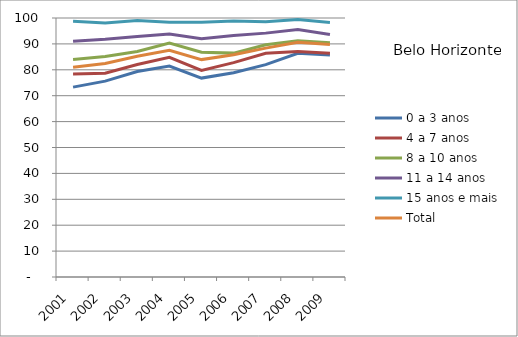
| Category | 0 a 3 anos | 4 a 7 anos | 8 a 10 anos | 11 a 14 anos | 15 anos e mais | Total |
|---|---|---|---|---|---|---|
| 2001.0 | 73.31 | 78.34 | 83.96 | 91.06 | 98.74 | 80.99 |
| 2002.0 | 75.62 | 78.65 | 85.15 | 91.78 | 98.1 | 82.45 |
| 2003.0 | 79.31 | 82.03 | 87.07 | 92.85 | 98.99 | 85.22 |
| 2004.0 | 81.43 | 84.85 | 90.32 | 93.82 | 98.35 | 87.5 |
| 2005.0 | 76.8 | 79.75 | 86.82 | 91.98 | 98.37 | 83.94 |
| 2006.0 | 78.88 | 82.76 | 86.44 | 93.23 | 98.83 | 85.79 |
| 2007.0 | 82 | 86.37 | 89.66 | 94.16 | 98.53 | 88.36 |
| 2008.0 | 86.35 | 87.1 | 91.22 | 95.58 | 99.39 | 90.59 |
| 2009.0 | 85.68 | 86.43 | 90.4 | 93.65 | 98.29 | 89.73 |